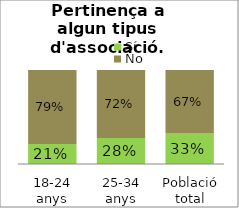
| Category | Sí | No |
|---|---|---|
| 18-24 anys | 0.213 | 0.787 |
| 25-34 anys | 0.277 | 0.723 |
| Població total | 0.329 | 0.669 |